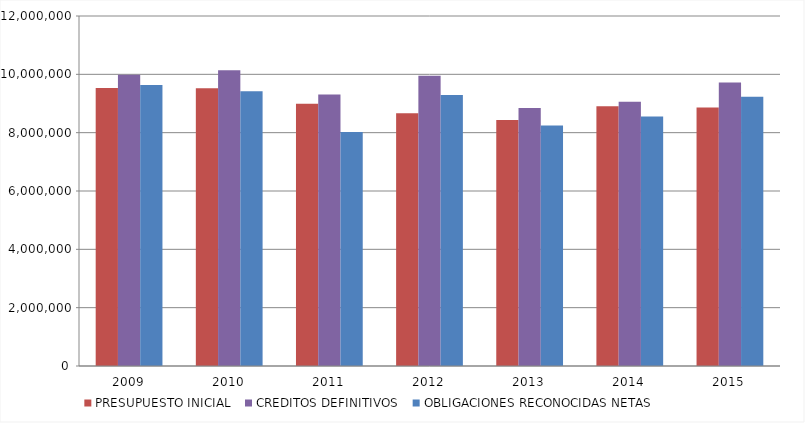
| Category | PRESUPUESTO INICIAL | CREDITOS DEFINITIVOS | OBLIGACIONES RECONOCIDAS NETAS |
|---|---|---|---|
| 2009.0 | 9534197.64 | 9987636.86 | 9634671.16 |
| 2010.0 | 9524842.97 | 10139766.74 | 9423472.18 |
| 2011.0 | 8994452.14 | 9309575.62 | 8021632.89 |
| 2012.0 | 8669304.36 | 9954733.37 | 9292039.76 |
| 2013.0 | 8430811.02 | 8847624.62 | 8246631.49 |
| 2014.0 | 8905196.68 | 9058511.44 | 8553660.33 |
| 2015.0 | 8865542.69 | 9716445.68 | 9229367.21 |